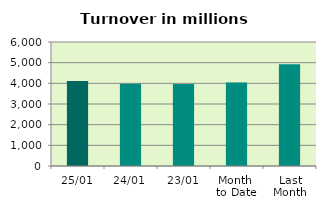
| Category | Series 0 |
|---|---|
| 25/01 | 4112.967 |
| 24/01 | 3983.166 |
| 23/01 | 3969.171 |
| Month 
to Date | 4036.881 |
| Last
Month | 4921.323 |